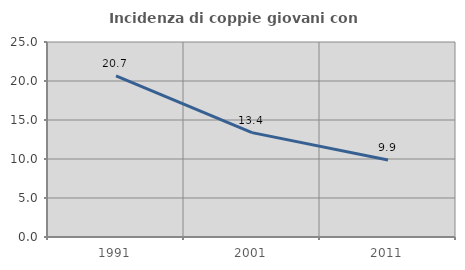
| Category | Incidenza di coppie giovani con figli |
|---|---|
| 1991.0 | 20.668 |
| 2001.0 | 13.385 |
| 2011.0 | 9.866 |